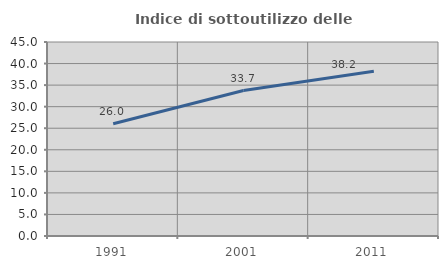
| Category | Indice di sottoutilizzo delle abitazioni  |
|---|---|
| 1991.0 | 26.037 |
| 2001.0 | 33.739 |
| 2011.0 | 38.218 |